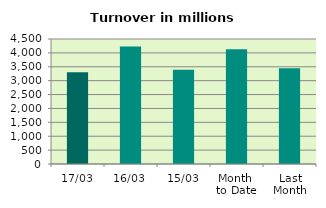
| Category | Series 0 |
|---|---|
| 17/03 | 3307.446 |
| 16/03 | 4231.306 |
| 15/03 | 3388.838 |
| Month 
to Date | 4126.661 |
| Last
Month | 3445.759 |